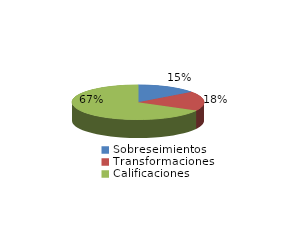
| Category | Series 0 |
|---|---|
| Sobreseimientos | 220 |
| Transformaciones | 269 |
| Calificaciones | 998 |